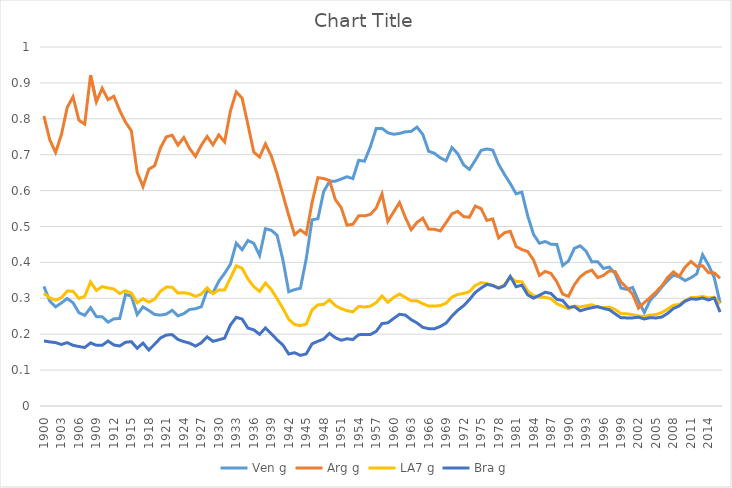
| Category | Ven g | Arg g | LA7 g | Bra g |
|---|---|---|---|---|
| 1900.0 | 0.333 | 0.808 | 0.314 | 0.181 |
| 1901.0 | 0.293 | 0.742 | 0.301 | 0.179 |
| 1902.0 | 0.276 | 0.706 | 0.295 | 0.177 |
| 1903.0 | 0.287 | 0.756 | 0.302 | 0.171 |
| 1904.0 | 0.299 | 0.832 | 0.32 | 0.177 |
| 1905.0 | 0.287 | 0.861 | 0.32 | 0.169 |
| 1906.0 | 0.26 | 0.796 | 0.299 | 0.166 |
| 1907.0 | 0.252 | 0.785 | 0.305 | 0.163 |
| 1908.0 | 0.274 | 0.922 | 0.345 | 0.176 |
| 1909.0 | 0.249 | 0.847 | 0.322 | 0.169 |
| 1910.0 | 0.249 | 0.885 | 0.333 | 0.169 |
| 1911.0 | 0.234 | 0.853 | 0.329 | 0.181 |
| 1912.0 | 0.243 | 0.863 | 0.326 | 0.17 |
| 1913.0 | 0.244 | 0.823 | 0.313 | 0.167 |
| 1914.0 | 0.311 | 0.791 | 0.321 | 0.178 |
| 1915.0 | 0.306 | 0.766 | 0.315 | 0.179 |
| 1916.0 | 0.255 | 0.651 | 0.288 | 0.161 |
| 1917.0 | 0.276 | 0.611 | 0.299 | 0.175 |
| 1918.0 | 0.266 | 0.66 | 0.289 | 0.156 |
| 1919.0 | 0.255 | 0.669 | 0.298 | 0.172 |
| 1920.0 | 0.253 | 0.719 | 0.32 | 0.19 |
| 1921.0 | 0.256 | 0.75 | 0.331 | 0.198 |
| 1922.0 | 0.266 | 0.754 | 0.331 | 0.199 |
| 1923.0 | 0.251 | 0.727 | 0.314 | 0.185 |
| 1924.0 | 0.257 | 0.748 | 0.316 | 0.179 |
| 1925.0 | 0.269 | 0.717 | 0.313 | 0.175 |
| 1926.0 | 0.271 | 0.695 | 0.305 | 0.167 |
| 1927.0 | 0.276 | 0.726 | 0.312 | 0.176 |
| 1928.0 | 0.322 | 0.751 | 0.329 | 0.193 |
| 1929.0 | 0.315 | 0.728 | 0.313 | 0.18 |
| 1930.0 | 0.348 | 0.755 | 0.323 | 0.184 |
| 1931.0 | 0.37 | 0.736 | 0.323 | 0.189 |
| 1932.0 | 0.395 | 0.822 | 0.356 | 0.226 |
| 1933.0 | 0.454 | 0.875 | 0.391 | 0.247 |
| 1934.0 | 0.435 | 0.858 | 0.384 | 0.242 |
| 1935.0 | 0.461 | 0.784 | 0.354 | 0.217 |
| 1936.0 | 0.453 | 0.707 | 0.333 | 0.212 |
| 1937.0 | 0.419 | 0.693 | 0.319 | 0.2 |
| 1938.0 | 0.494 | 0.73 | 0.343 | 0.217 |
| 1939.0 | 0.49 | 0.697 | 0.325 | 0.202 |
| 1940.0 | 0.476 | 0.647 | 0.299 | 0.184 |
| 1941.0 | 0.407 | 0.589 | 0.272 | 0.17 |
| 1942.0 | 0.318 | 0.531 | 0.242 | 0.145 |
| 1943.0 | 0.324 | 0.477 | 0.227 | 0.148 |
| 1944.0 | 0.328 | 0.49 | 0.224 | 0.141 |
| 1945.0 | 0.41 | 0.478 | 0.228 | 0.145 |
| 1946.0 | 0.519 | 0.566 | 0.268 | 0.173 |
| 1947.0 | 0.522 | 0.636 | 0.282 | 0.18 |
| 1948.0 | 0.598 | 0.634 | 0.283 | 0.186 |
| 1949.0 | 0.626 | 0.628 | 0.296 | 0.202 |
| 1950.0 | 0.626 | 0.575 | 0.28 | 0.19 |
| 1951.0 | 0.632 | 0.553 | 0.271 | 0.183 |
| 1952.0 | 0.639 | 0.504 | 0.266 | 0.187 |
| 1953.0 | 0.634 | 0.506 | 0.262 | 0.185 |
| 1954.0 | 0.684 | 0.53 | 0.278 | 0.199 |
| 1955.0 | 0.682 | 0.53 | 0.276 | 0.199 |
| 1956.0 | 0.722 | 0.534 | 0.278 | 0.199 |
| 1957.0 | 0.773 | 0.551 | 0.288 | 0.208 |
| 1958.0 | 0.773 | 0.591 | 0.306 | 0.23 |
| 1959.0 | 0.761 | 0.514 | 0.289 | 0.232 |
| 1960.0 | 0.757 | 0.541 | 0.302 | 0.244 |
| 1961.0 | 0.759 | 0.567 | 0.312 | 0.256 |
| 1962.0 | 0.764 | 0.525 | 0.302 | 0.253 |
| 1963.0 | 0.765 | 0.491 | 0.293 | 0.241 |
| 1964.0 | 0.777 | 0.511 | 0.293 | 0.231 |
| 1965.0 | 0.757 | 0.523 | 0.285 | 0.219 |
| 1966.0 | 0.71 | 0.493 | 0.278 | 0.216 |
| 1967.0 | 0.704 | 0.492 | 0.278 | 0.215 |
| 1968.0 | 0.691 | 0.488 | 0.279 | 0.222 |
| 1969.0 | 0.683 | 0.511 | 0.287 | 0.231 |
| 1970.0 | 0.72 | 0.535 | 0.303 | 0.251 |
| 1971.0 | 0.703 | 0.542 | 0.311 | 0.267 |
| 1972.0 | 0.672 | 0.528 | 0.313 | 0.279 |
| 1973.0 | 0.659 | 0.526 | 0.319 | 0.296 |
| 1974.0 | 0.684 | 0.557 | 0.336 | 0.316 |
| 1975.0 | 0.712 | 0.55 | 0.344 | 0.328 |
| 1976.0 | 0.716 | 0.517 | 0.341 | 0.339 |
| 1977.0 | 0.713 | 0.521 | 0.336 | 0.335 |
| 1978.0 | 0.673 | 0.468 | 0.329 | 0.328 |
| 1979.0 | 0.645 | 0.482 | 0.338 | 0.335 |
| 1980.0 | 0.62 | 0.487 | 0.359 | 0.361 |
| 1981.0 | 0.591 | 0.445 | 0.347 | 0.332 |
| 1982.0 | 0.596 | 0.436 | 0.346 | 0.336 |
| 1983.0 | 0.529 | 0.43 | 0.32 | 0.309 |
| 1984.0 | 0.478 | 0.407 | 0.307 | 0.3 |
| 1985.0 | 0.453 | 0.364 | 0.303 | 0.308 |
| 1986.0 | 0.458 | 0.375 | 0.303 | 0.317 |
| 1987.0 | 0.45 | 0.369 | 0.299 | 0.313 |
| 1988.0 | 0.45 | 0.345 | 0.285 | 0.297 |
| 1989.0 | 0.391 | 0.312 | 0.278 | 0.294 |
| 1990.0 | 0.404 | 0.306 | 0.27 | 0.275 |
| 1991.0 | 0.439 | 0.338 | 0.279 | 0.277 |
| 1992.0 | 0.446 | 0.36 | 0.276 | 0.265 |
| 1993.0 | 0.431 | 0.372 | 0.279 | 0.27 |
| 1994.0 | 0.401 | 0.378 | 0.282 | 0.274 |
| 1995.0 | 0.402 | 0.358 | 0.275 | 0.277 |
| 1996.0 | 0.383 | 0.364 | 0.274 | 0.272 |
| 1997.0 | 0.387 | 0.376 | 0.275 | 0.268 |
| 1998.0 | 0.369 | 0.374 | 0.269 | 0.257 |
| 1999.0 | 0.329 | 0.346 | 0.257 | 0.246 |
| 2000.0 | 0.325 | 0.329 | 0.257 | 0.245 |
| 2001.0 | 0.33 | 0.312 | 0.254 | 0.245 |
| 2002.0 | 0.293 | 0.273 | 0.251 | 0.247 |
| 2003.0 | 0.26 | 0.288 | 0.249 | 0.242 |
| 2004.0 | 0.294 | 0.302 | 0.253 | 0.246 |
| 2005.0 | 0.312 | 0.318 | 0.254 | 0.245 |
| 2006.0 | 0.331 | 0.334 | 0.26 | 0.248 |
| 2007.0 | 0.349 | 0.358 | 0.27 | 0.258 |
| 2008.0 | 0.365 | 0.374 | 0.281 | 0.272 |
| 2009.0 | 0.36 | 0.361 | 0.283 | 0.279 |
| 2010.0 | 0.349 | 0.387 | 0.294 | 0.292 |
| 2011.0 | 0.357 | 0.403 | 0.302 | 0.299 |
| 2012.0 | 0.368 | 0.389 | 0.302 | 0.297 |
| 2013.0 | 0.421 | 0.391 | 0.305 | 0.301 |
| 2014.0 | 0.393 | 0.371 | 0.301 | 0.295 |
| 2015.0 | 0.358 | 0.371 | 0.303 | 0.301 |
| 2016.0 | 0.287 | 0.356 | 0.284 | 0.262 |